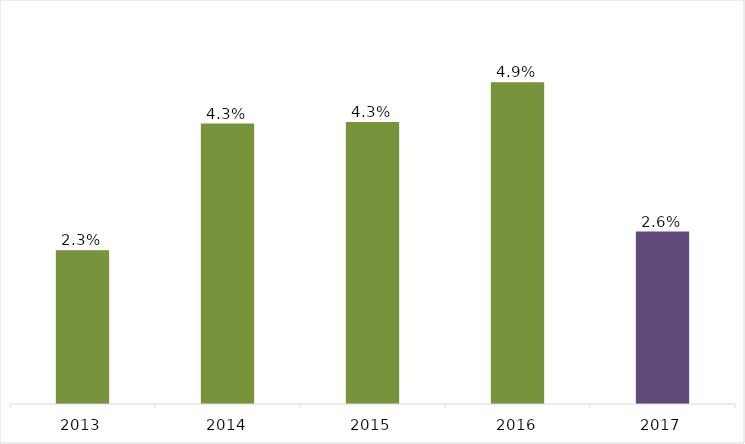
| Category | Tasa crecimiento |
|---|---|
| 2013.0 | 0.023 |
| 2014.0 | 0.043 |
| 2015.0 | 0.043 |
| 2016.0 | 0.049 |
| 2017.0 | 0.026 |